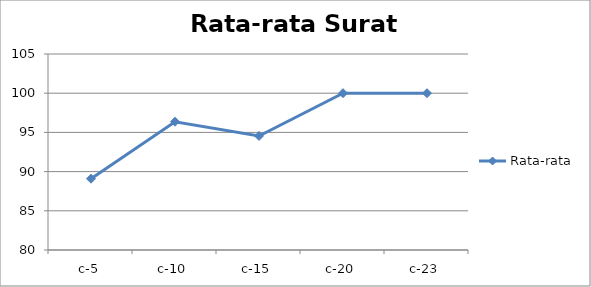
| Category | Rata-rata |
|---|---|
| c-5 | 89.091 |
| c-10 | 96.364 |
| c-15 | 94.545 |
| c-20 | 100 |
| c-23 | 100 |